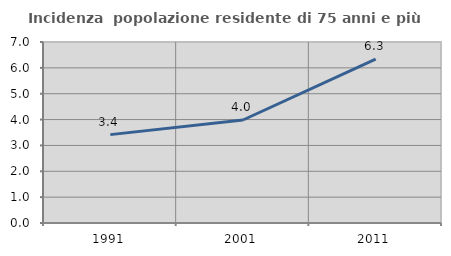
| Category | Incidenza  popolazione residente di 75 anni e più |
|---|---|
| 1991.0 | 3.418 |
| 2001.0 | 3.983 |
| 2011.0 | 6.337 |